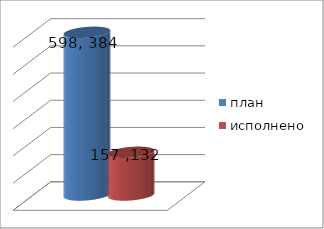
| Category | план | исполнено |
|---|---|---|
| 0 | 598384402.46 | 157132650.42 |